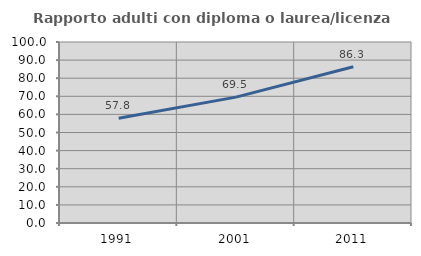
| Category | Rapporto adulti con diploma o laurea/licenza media  |
|---|---|
| 1991.0 | 57.838 |
| 2001.0 | 69.543 |
| 2011.0 | 86.341 |